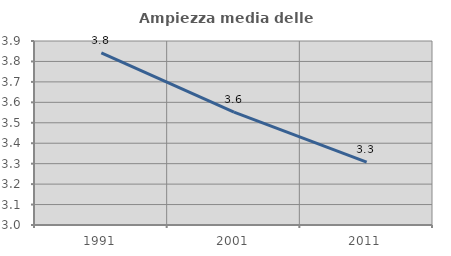
| Category | Ampiezza media delle famiglie |
|---|---|
| 1991.0 | 3.842 |
| 2001.0 | 3.552 |
| 2011.0 | 3.308 |